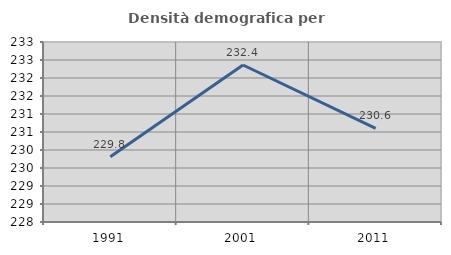
| Category | Densità demografica |
|---|---|
| 1991.0 | 229.815 |
| 2001.0 | 232.361 |
| 2011.0 | 230.599 |